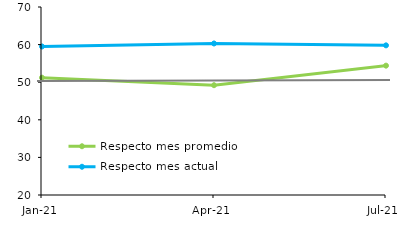
| Category | Respecto mes promedio | Respecto mes actual |
|---|---|---|
| 2021-01-01 | 51.2 | 59.5 |
| 2021-04-01 | 49.2 | 60.3 |
| 2021-07-01 | 54.4 | 59.8 |